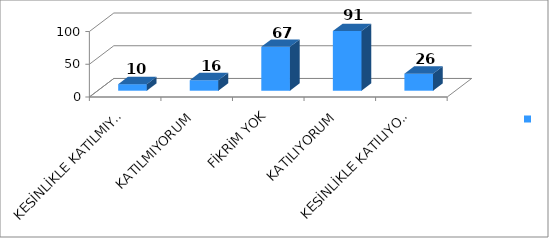
| Category | Series 0 |
|---|---|
| KESİNLİKLE KATILMIYORUM | 10 |
| KATILMIYORUM | 16 |
| FİKRİM YOK | 67 |
| KATILIYORUM | 91 |
| KESİNLİKLE KATILIYORUM | 26 |